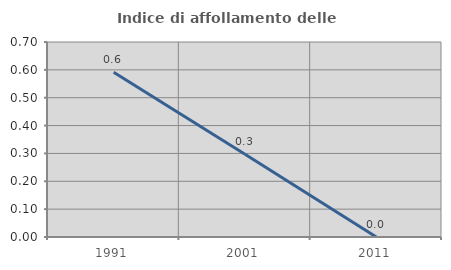
| Category | Indice di affollamento delle abitazioni  |
|---|---|
| 1991.0 | 0.592 |
| 2001.0 | 0.297 |
| 2011.0 | 0 |